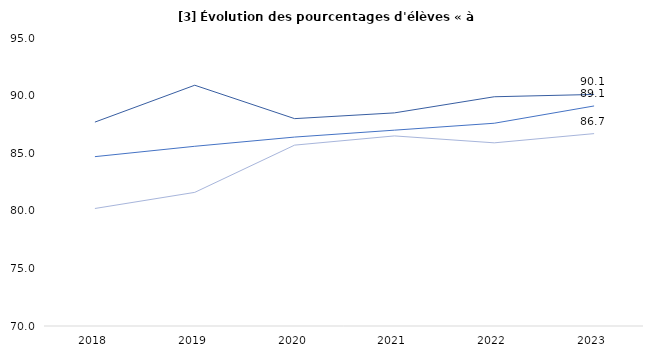
| Category | seconde | première | terminale |
|---|---|---|---|
| 2018 | 87.7 | 84.7 | 80.2 |
| 2019 | 90.9 | 85.6 | 81.6 |
| 2020 | 88 | 86.4 | 85.7 |
| 2021 | 88.5 | 87 | 86.5 |
| 2022 | 89.9 | 87.6 | 85.9 |
| 2023 | 90.1 | 89.1 | 86.7 |